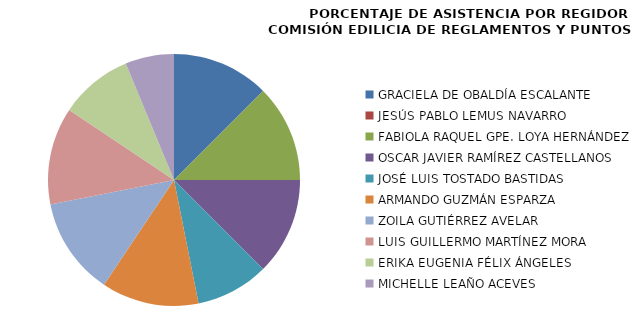
| Category | Series 0 |
|---|---|
| GRACIELA DE OBALDÍA ESCALANTE | 100 |
| JESÚS PABLO LEMUS NAVARRO | 0 |
| FABIOLA RAQUEL GPE. LOYA HERNÁNDEZ | 100 |
| OSCAR JAVIER RAMÍREZ CASTELLANOS | 100 |
| JOSÉ LUIS TOSTADO BASTIDAS | 75 |
| ARMANDO GUZMÁN ESPARZA | 100 |
| ZOILA GUTIÉRREZ AVELAR | 100 |
| LUIS GUILLERMO MARTÍNEZ MORA | 100 |
| ERIKA EUGENIA FÉLIX ÁNGELES | 75 |
| MICHELLE LEAÑO ACEVES | 50 |